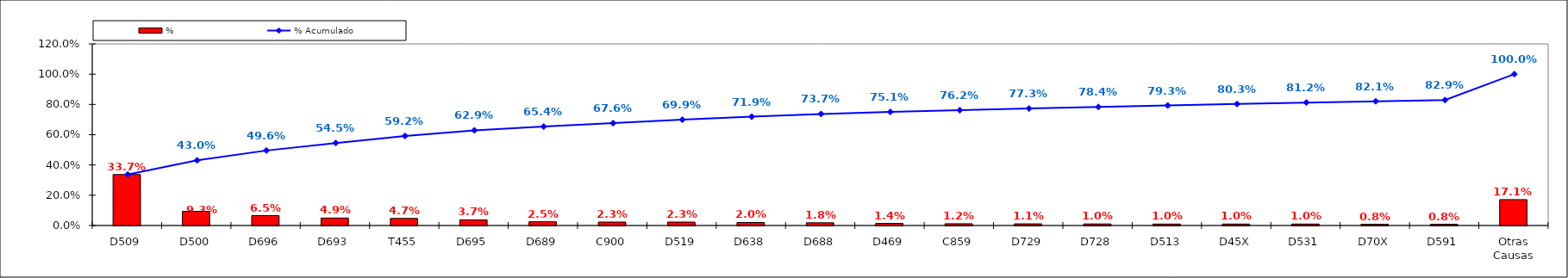
| Category | % |
|---|---|
| D509 | 0.337 |
| D500 | 0.093 |
| D696 | 0.065 |
| D693 | 0.049 |
| T455 | 0.047 |
| D695 | 0.037 |
| D689 | 0.025 |
| C900 | 0.023 |
| D519 | 0.023 |
| D638 | 0.02 |
| D688 | 0.018 |
| D469 | 0.014 |
| C859 | 0.012 |
| D729 | 0.011 |
| D728 | 0.01 |
| D513 | 0.01 |
| D45X | 0.01 |
| D531 | 0.01 |
| D70X | 0.008 |
| D591 | 0.008 |
| Otras Causas | 0.171 |